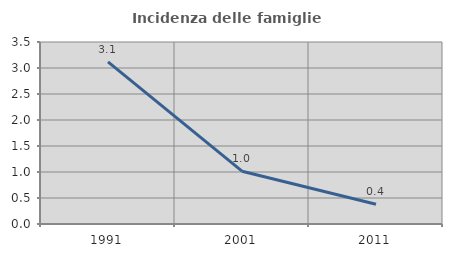
| Category | Incidenza delle famiglie numerose |
|---|---|
| 1991.0 | 3.117 |
| 2001.0 | 1.015 |
| 2011.0 | 0.379 |